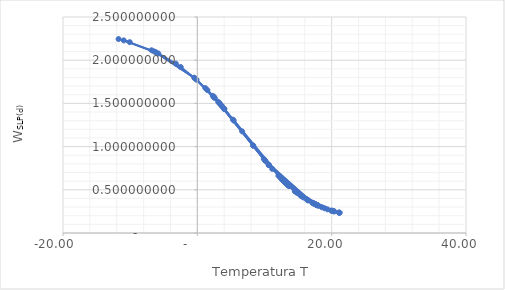
| Category | Series 0 |
|---|---|
| -11.73 | 2.245 |
| -10.06 | 2.209 |
| -10.96 | 2.229 |
| -6.17 | 2.092 |
| -0.34 | 1.789 |
| 2.44 | 1.576 |
| 3.61 | 1.473 |
| 3.71 | 1.464 |
| 3.27 | 1.503 |
| 6.67 | 1.177 |
| 9.89 | 0.858 |
| 10.58 | 0.793 |
| 8.33 | 1.01 |
| 4.0 | 1.437 |
| 3.1 | 1.519 |
| -0.46 | 1.798 |
| -6.43 | 2.101 |
| -6.81 | 2.115 |
| -5.81 | 2.078 |
| -3.2 | 1.961 |
| -2.47 | 1.921 |
| -0.12 | 1.774 |
| 1.5 | 1.653 |
| 2.3 | 1.588 |
| 2.48 | 1.572 |
| 3.36 | 1.495 |
| 1.19 | 1.678 |
| 3.96 | 1.441 |
| 5.31 | 1.312 |
| 8.3 | 1.013 |
| 10.12 | 0.836 |
| 2.6 | 1.562 |
| 4.02 | 1.435 |
| 11.15 | 0.742 |
| 12.77 | 0.608 |
| 12.65 | 0.617 |
| 5.41 | 1.302 |
| 10.67 | 0.785 |
| 15.57 | 0.424 |
| 17.22 | 0.346 |
| 14.53 | 0.485 |
| 13.66 | 0.543 |
| 17.34 | 0.341 |
| 14.87 | 0.464 |
| 13.58 | 0.548 |
| 17.7 | 0.327 |
| 16.5 | 0.378 |
| 12.36 | 0.64 |
| 12.62 | 0.62 |
| 15.53 | 0.427 |
| 14.51 | 0.486 |
| 18.54 | 0.298 |
| 13.43 | 0.559 |
| 15.82 | 0.411 |
| 15.39 | 0.434 |
| 17.1 | 0.351 |
| 10.11 | 0.837 |
| 10.65 | 0.787 |
| 17.28 | 0.344 |
| 20.28 | 0.252 |
| 19.97 | 0.259 |
| 17.37 | 0.34 |
| 17.74 | 0.326 |
| 20.39 | 0.25 |
| 15.57 | 0.424 |
| 13.15 | 0.579 |
| 13.46 | 0.557 |
| 15.34 | 0.437 |
| 16.27 | 0.389 |
| 17.69 | 0.328 |
| 19.38 | 0.274 |
| 17.58 | 0.332 |
| 16.47 | 0.379 |
| 17.88 | 0.321 |
| 13.15 | 0.579 |
| 12.07 | 0.664 |
| 12.94 | 0.595 |
| 13.0 | 0.59 |
| 12.82 | 0.604 |
| 13.26 | 0.571 |
| 14.63 | 0.479 |
| 14.79 | 0.469 |
| 17.7 | 0.327 |
| 18.05 | 0.315 |
| 17.85 | 0.322 |
| 17.83 | 0.323 |
| 18.94 | 0.286 |
| 21.17 | 0.235 |
| 21.06 | 0.237 |
| 19.99 | 0.259 |
| 20.21 | 0.254 |
| 21.18 | 0.235 |